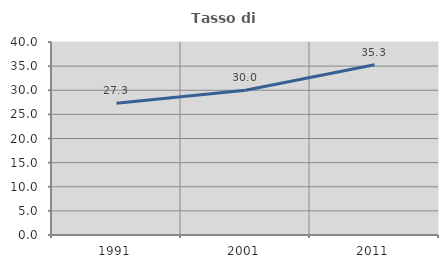
| Category | Tasso di occupazione   |
|---|---|
| 1991.0 | 27.296 |
| 2001.0 | 30.019 |
| 2011.0 | 35.291 |